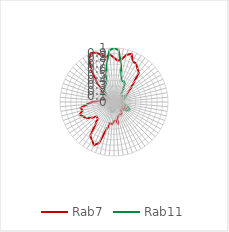
| Category | Rab7 | Rab11 |
|---|---|---|
| 0.0 | 0.821 | 1 |
| 0.10913 | 0.766 | 0.966 |
| 0.21825 | 0.803 | 0.735 |
| 0.32738 | 0.905 | 0.518 |
| 0.43651 | 0.95 | 0.416 |
| 0.54563 | 0.829 | 0.425 |
| 0.65476 | 0.821 | 0.397 |
| 0.76389 | 0.755 | 0.303 |
| 0.87302 | 0.72 | 0.22 |
| 0.98214 | 0.528 | 0.175 |
| 1.09127 | 0.415 | 0.157 |
| 1.2004 | 0.33 | 0.197 |
| 1.30952 | 0.274 | 0.206 |
| 1.41865 | 0.214 | 0.25 |
| 1.52778 | 0.148 | 0.225 |
| 1.6369 | 0.044 | 0.198 |
| 1.74603 | 0.1 | 0.157 |
| 1.85516 | 0.103 | 0.168 |
| 1.96429 | 0.093 | 0.132 |
| 2.07341 | 0.131 | 0.163 |
| 2.18254 | 0.155 | 0.166 |
| 2.29167 | 0.197 | 0.228 |
| 2.40079 | 0.175 | 0.282 |
| 2.50992 | 0.219 | 0.322 |
| 2.61905 | 0.277 | 0.313 |
| 2.72817 | 0.173 | 0.278 |
| 2.8373 | 0.126 | 0.211 |
| 2.94643 | 0.151 | 0.134 |
| 3.05556 | 0.152 | 0.115 |
| 3.16468 | 0.252 | 0.103 |
| 3.27381 | 0.268 | 0.097 |
| 3.38294 | 0.242 | 0.094 |
| 3.49206 | 0.256 | 0.087 |
| 3.60119 | 0.272 | 0.104 |
| 3.71032 | 0.392 | 0.127 |
| 3.81944 | 0.337 | 0.121 |
| 3.92857 | 0.356 | 0.153 |
| 4.0377 | 0.414 | 0.174 |
| 4.14683 | 0.397 | 0.182 |
| 4.25595 | 0.509 | 0.184 |
| 4.36508 | 0.808 | 0.173 |
| 4.47421 | 0.883 | 0.148 |
| 4.58333 | 0.814 | 0.136 |
| 4.69246 | 0.767 | 0.136 |
| 4.80159 | 0.524 | 0.095 |
| 4.91071 | 0.429 | 0.08 |
| 5.01984 | 0.421 | 0.06 |
| 5.12897 | 0.511 | 0.041 |
| 5.2381 | 0.599 | 0.039 |
| 5.34722 | 0.632 | 0.028 |
| 5.45635 | 0.674 | 0.021 |
| 5.56548 | 0.605 | 0.031 |
| 5.6746 | 0.626 | 0.028 |
| 5.78373 | 0.5 | 0.07 |
| 5.89286 | 0.409 | 0.118 |
| 6.00198 | 0.272 | 0.127 |
| 6.11111 | 0.234 | 0.076 |
| 6.22024 | 0.111 | 0.022 |
| 6.32937 | 0.033 | 0 |
| 6.43849 | 0 | 0.01 |
| 6.54762 | 0.051 | 0.015 |
| 6.65675 | 0.064 | 0.052 |
| 6.76587 | 0.243 | 0.13 |
| 6.875 | 0.331 | 0.199 |
| 6.98413 | 0.522 | 0.28 |
| 7.09325 | 0.737 | 0.325 |
| 7.20238 | 0.92 | 0.346 |
| 7.31151 | 1 | 0.36 |
| 7.42063 | 0.971 | 0.412 |
| 7.52976 | 0.905 | 0.553 |
| 7.63889 | 0.844 | 0.758 |
| 7.74802 | 0.883 | 0.963 |